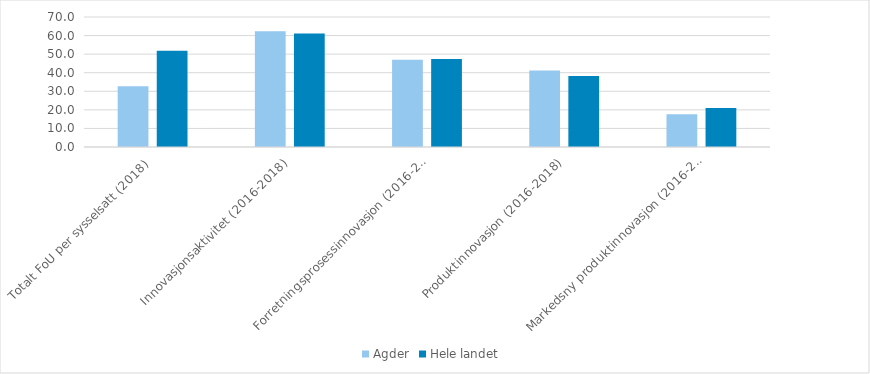
| Category | Agder | Hele landet  |
|---|---|---|
| Totalt FoU per sysselsatt (2018) | 32.663 | 51.82 |
| Innovasjonsaktivitet (2016-2018) | 62.361 | 61.147 |
| Forretningsprosessinnovasjon (2016-2018) | 47 | 47.427 |
| Produktinnovasjon (2016-2018) | 41.168 | 38.209 |
| Markedsny produktinnovasjon (2016-2018) | 17.609 | 21.052 |